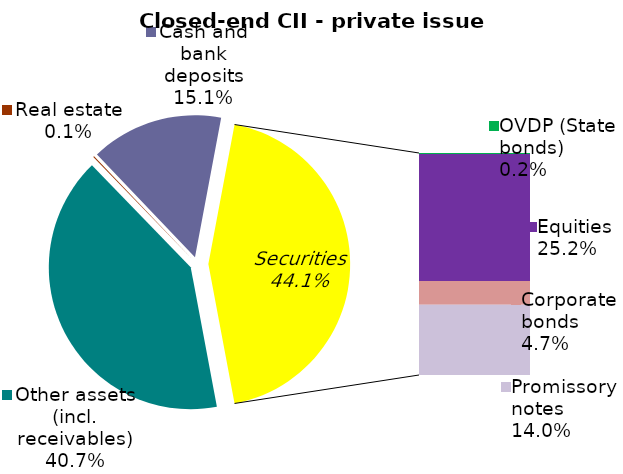
| Category | Series 0 |
|---|---|
| Other assets (incl. receivables) | 0.407 |
| Real estate | 0.001 |
| Cash and bank deposits | 0.151 |
| OVDP (State bonds) | 0.002 |
| Equities | 0.252 |
| Corporate bonds | 0.047 |
| Promissory notes | 0.14 |